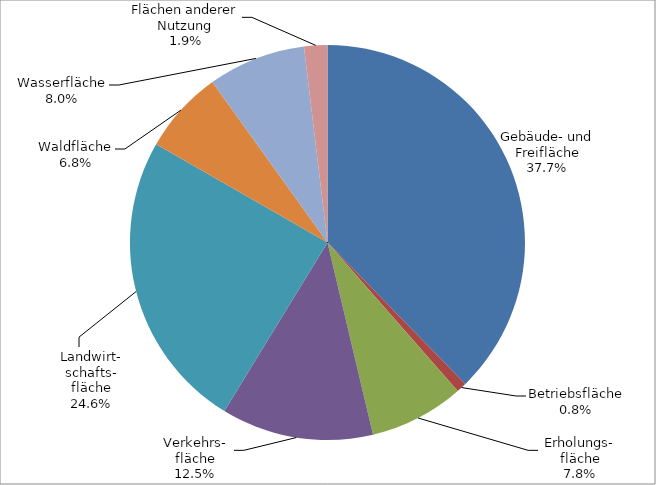
| Category | 2014 |
|---|---|
| Gebäude- und Freifläche | 28480.518 |
| Betriebsfläche | 628.282 |
| Erholungs-
fläche | 5853.492 |
| Verkehrs-
fläche | 9399.93 |
| Landwirt-
schafts-
fläche | 18533.018 |
| Waldfläche | 5143.399 |
| Wasserfläche | 6044.934 |
| Flächen anderer Nutzung | 1438.196 |